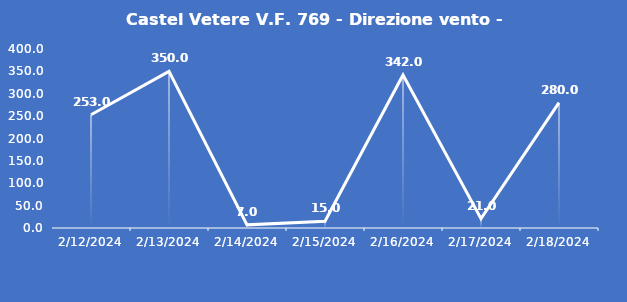
| Category | Castel Vetere V.F. 769 - Direzione vento - Grezzo (°N) |
|---|---|
| 2/12/24 | 253 |
| 2/13/24 | 350 |
| 2/14/24 | 7 |
| 2/15/24 | 15 |
| 2/16/24 | 342 |
| 2/17/24 | 21 |
| 2/18/24 | 280 |